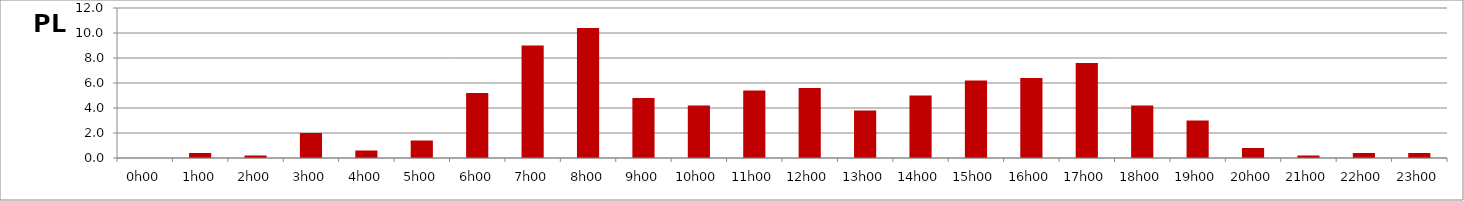
| Category | PL |
|---|---|
| 0.0 | 0 |
| 0.041666666666666664 | 0.4 |
| 0.08333333333333333 | 0.2 |
| 0.125 | 2 |
| 0.16666666666666666 | 0.6 |
| 0.20833333333333334 | 1.4 |
| 0.25 | 5.2 |
| 0.2916666666666667 | 9 |
| 0.3333333333333333 | 10.4 |
| 0.375 | 4.8 |
| 0.4166666666666667 | 4.2 |
| 0.4583333333333333 | 5.4 |
| 0.5 | 5.6 |
| 0.5416666666666666 | 3.8 |
| 0.5833333333333334 | 5 |
| 0.625 | 6.2 |
| 0.6666666666666666 | 6.4 |
| 0.7083333333333334 | 7.6 |
| 0.75 | 4.2 |
| 0.7916666666666666 | 3 |
| 0.8333333333333334 | 0.8 |
| 0.875 | 0.2 |
| 0.9166666666666666 | 0.4 |
| 0.9583333333333334 | 0.4 |